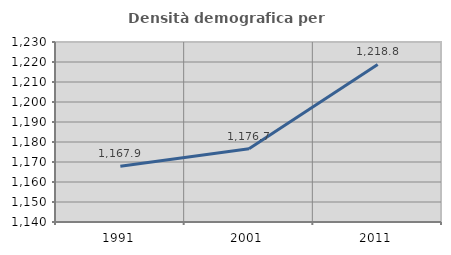
| Category | Densità demografica |
|---|---|
| 1991.0 | 1167.89 |
| 2001.0 | 1176.669 |
| 2011.0 | 1218.765 |